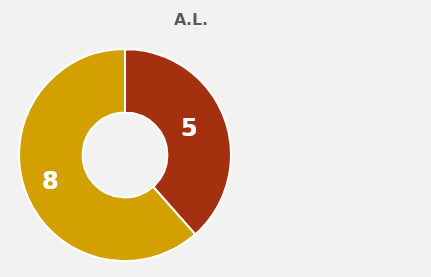
| Category | A.L. TEUSAQUILLO |
|---|---|
| PQRS Vencidas | 5 |
| PQRS con Respuesta Exemporánea | 8 |